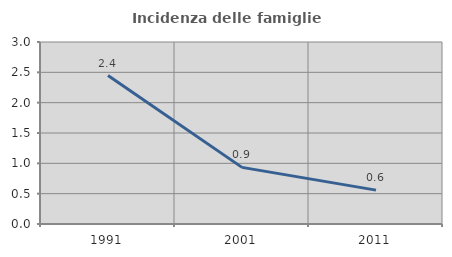
| Category | Incidenza delle famiglie numerose |
|---|---|
| 1991.0 | 2.447 |
| 2001.0 | 0.933 |
| 2011.0 | 0.559 |